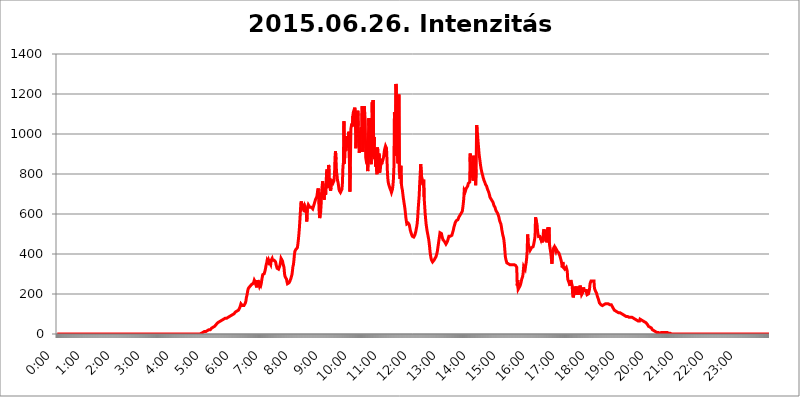
| Category | 2015.06.26. Intenzitás [W/m^2] |
|---|---|
| 0.0 | 0 |
| 0.0006944444444444445 | 0 |
| 0.001388888888888889 | 0 |
| 0.0020833333333333333 | 0 |
| 0.002777777777777778 | 0 |
| 0.003472222222222222 | 0 |
| 0.004166666666666667 | 0 |
| 0.004861111111111111 | 0 |
| 0.005555555555555556 | 0 |
| 0.0062499999999999995 | 0 |
| 0.006944444444444444 | 0 |
| 0.007638888888888889 | 0 |
| 0.008333333333333333 | 0 |
| 0.009027777777777779 | 0 |
| 0.009722222222222222 | 0 |
| 0.010416666666666666 | 0 |
| 0.011111111111111112 | 0 |
| 0.011805555555555555 | 0 |
| 0.012499999999999999 | 0 |
| 0.013194444444444444 | 0 |
| 0.013888888888888888 | 0 |
| 0.014583333333333332 | 0 |
| 0.015277777777777777 | 0 |
| 0.015972222222222224 | 0 |
| 0.016666666666666666 | 0 |
| 0.017361111111111112 | 0 |
| 0.018055555555555557 | 0 |
| 0.01875 | 0 |
| 0.019444444444444445 | 0 |
| 0.02013888888888889 | 0 |
| 0.020833333333333332 | 0 |
| 0.02152777777777778 | 0 |
| 0.022222222222222223 | 0 |
| 0.02291666666666667 | 0 |
| 0.02361111111111111 | 0 |
| 0.024305555555555556 | 0 |
| 0.024999999999999998 | 0 |
| 0.025694444444444447 | 0 |
| 0.02638888888888889 | 0 |
| 0.027083333333333334 | 0 |
| 0.027777777777777776 | 0 |
| 0.02847222222222222 | 0 |
| 0.029166666666666664 | 0 |
| 0.029861111111111113 | 0 |
| 0.030555555555555555 | 0 |
| 0.03125 | 0 |
| 0.03194444444444445 | 0 |
| 0.03263888888888889 | 0 |
| 0.03333333333333333 | 0 |
| 0.034027777777777775 | 0 |
| 0.034722222222222224 | 0 |
| 0.035416666666666666 | 0 |
| 0.036111111111111115 | 0 |
| 0.03680555555555556 | 0 |
| 0.0375 | 0 |
| 0.03819444444444444 | 0 |
| 0.03888888888888889 | 0 |
| 0.03958333333333333 | 0 |
| 0.04027777777777778 | 0 |
| 0.04097222222222222 | 0 |
| 0.041666666666666664 | 0 |
| 0.042361111111111106 | 0 |
| 0.04305555555555556 | 0 |
| 0.043750000000000004 | 0 |
| 0.044444444444444446 | 0 |
| 0.04513888888888889 | 0 |
| 0.04583333333333334 | 0 |
| 0.04652777777777778 | 0 |
| 0.04722222222222222 | 0 |
| 0.04791666666666666 | 0 |
| 0.04861111111111111 | 0 |
| 0.049305555555555554 | 0 |
| 0.049999999999999996 | 0 |
| 0.05069444444444445 | 0 |
| 0.051388888888888894 | 0 |
| 0.052083333333333336 | 0 |
| 0.05277777777777778 | 0 |
| 0.05347222222222222 | 0 |
| 0.05416666666666667 | 0 |
| 0.05486111111111111 | 0 |
| 0.05555555555555555 | 0 |
| 0.05625 | 0 |
| 0.05694444444444444 | 0 |
| 0.057638888888888885 | 0 |
| 0.05833333333333333 | 0 |
| 0.05902777777777778 | 0 |
| 0.059722222222222225 | 0 |
| 0.06041666666666667 | 0 |
| 0.061111111111111116 | 0 |
| 0.06180555555555556 | 0 |
| 0.0625 | 0 |
| 0.06319444444444444 | 0 |
| 0.06388888888888888 | 0 |
| 0.06458333333333334 | 0 |
| 0.06527777777777778 | 0 |
| 0.06597222222222222 | 0 |
| 0.06666666666666667 | 0 |
| 0.06736111111111111 | 0 |
| 0.06805555555555555 | 0 |
| 0.06874999999999999 | 0 |
| 0.06944444444444443 | 0 |
| 0.07013888888888889 | 0 |
| 0.07083333333333333 | 0 |
| 0.07152777777777779 | 0 |
| 0.07222222222222223 | 0 |
| 0.07291666666666667 | 0 |
| 0.07361111111111111 | 0 |
| 0.07430555555555556 | 0 |
| 0.075 | 0 |
| 0.07569444444444444 | 0 |
| 0.0763888888888889 | 0 |
| 0.07708333333333334 | 0 |
| 0.07777777777777778 | 0 |
| 0.07847222222222222 | 0 |
| 0.07916666666666666 | 0 |
| 0.0798611111111111 | 0 |
| 0.08055555555555556 | 0 |
| 0.08125 | 0 |
| 0.08194444444444444 | 0 |
| 0.08263888888888889 | 0 |
| 0.08333333333333333 | 0 |
| 0.08402777777777777 | 0 |
| 0.08472222222222221 | 0 |
| 0.08541666666666665 | 0 |
| 0.08611111111111112 | 0 |
| 0.08680555555555557 | 0 |
| 0.08750000000000001 | 0 |
| 0.08819444444444445 | 0 |
| 0.08888888888888889 | 0 |
| 0.08958333333333333 | 0 |
| 0.09027777777777778 | 0 |
| 0.09097222222222222 | 0 |
| 0.09166666666666667 | 0 |
| 0.09236111111111112 | 0 |
| 0.09305555555555556 | 0 |
| 0.09375 | 0 |
| 0.09444444444444444 | 0 |
| 0.09513888888888888 | 0 |
| 0.09583333333333333 | 0 |
| 0.09652777777777777 | 0 |
| 0.09722222222222222 | 0 |
| 0.09791666666666667 | 0 |
| 0.09861111111111111 | 0 |
| 0.09930555555555555 | 0 |
| 0.09999999999999999 | 0 |
| 0.10069444444444443 | 0 |
| 0.1013888888888889 | 0 |
| 0.10208333333333335 | 0 |
| 0.10277777777777779 | 0 |
| 0.10347222222222223 | 0 |
| 0.10416666666666667 | 0 |
| 0.10486111111111111 | 0 |
| 0.10555555555555556 | 0 |
| 0.10625 | 0 |
| 0.10694444444444444 | 0 |
| 0.1076388888888889 | 0 |
| 0.10833333333333334 | 0 |
| 0.10902777777777778 | 0 |
| 0.10972222222222222 | 0 |
| 0.1111111111111111 | 0 |
| 0.11180555555555556 | 0 |
| 0.11180555555555556 | 0 |
| 0.1125 | 0 |
| 0.11319444444444444 | 0 |
| 0.11388888888888889 | 0 |
| 0.11458333333333333 | 0 |
| 0.11527777777777777 | 0 |
| 0.11597222222222221 | 0 |
| 0.11666666666666665 | 0 |
| 0.1173611111111111 | 0 |
| 0.11805555555555557 | 0 |
| 0.11944444444444445 | 0 |
| 0.12013888888888889 | 0 |
| 0.12083333333333333 | 0 |
| 0.12152777777777778 | 0 |
| 0.12222222222222223 | 0 |
| 0.12291666666666667 | 0 |
| 0.12291666666666667 | 0 |
| 0.12361111111111112 | 0 |
| 0.12430555555555556 | 0 |
| 0.125 | 0 |
| 0.12569444444444444 | 0 |
| 0.12638888888888888 | 0 |
| 0.12708333333333333 | 0 |
| 0.16875 | 0 |
| 0.12847222222222224 | 0 |
| 0.12916666666666668 | 0 |
| 0.12986111111111112 | 0 |
| 0.13055555555555556 | 0 |
| 0.13125 | 0 |
| 0.13194444444444445 | 0 |
| 0.1326388888888889 | 0 |
| 0.13333333333333333 | 0 |
| 0.13402777777777777 | 0 |
| 0.13402777777777777 | 0 |
| 0.13472222222222222 | 0 |
| 0.13541666666666666 | 0 |
| 0.1361111111111111 | 0 |
| 0.13749999999999998 | 0 |
| 0.13819444444444443 | 0 |
| 0.1388888888888889 | 0 |
| 0.13958333333333334 | 0 |
| 0.14027777777777778 | 0 |
| 0.14097222222222222 | 0 |
| 0.14166666666666666 | 0 |
| 0.1423611111111111 | 0 |
| 0.14305555555555557 | 0 |
| 0.14375000000000002 | 0 |
| 0.14444444444444446 | 0 |
| 0.1451388888888889 | 0 |
| 0.1451388888888889 | 0 |
| 0.14652777777777778 | 0 |
| 0.14722222222222223 | 0 |
| 0.14791666666666667 | 0 |
| 0.1486111111111111 | 0 |
| 0.14930555555555555 | 0 |
| 0.15 | 0 |
| 0.15069444444444444 | 0 |
| 0.15138888888888888 | 0 |
| 0.15208333333333332 | 0 |
| 0.15277777777777776 | 0 |
| 0.15347222222222223 | 0 |
| 0.15416666666666667 | 0 |
| 0.15486111111111112 | 0 |
| 0.15555555555555556 | 0 |
| 0.15625 | 0 |
| 0.15694444444444444 | 0 |
| 0.15763888888888888 | 0 |
| 0.15833333333333333 | 0 |
| 0.15902777777777777 | 0 |
| 0.15972222222222224 | 0 |
| 0.16041666666666668 | 0 |
| 0.16111111111111112 | 0 |
| 0.16180555555555556 | 0 |
| 0.1625 | 0 |
| 0.16319444444444445 | 0 |
| 0.1638888888888889 | 0 |
| 0.16458333333333333 | 0 |
| 0.16527777777777777 | 0 |
| 0.16597222222222222 | 0 |
| 0.16666666666666666 | 0 |
| 0.1673611111111111 | 0 |
| 0.16805555555555554 | 0 |
| 0.16874999999999998 | 0 |
| 0.16944444444444443 | 0 |
| 0.17013888888888887 | 0 |
| 0.1708333333333333 | 0 |
| 0.17152777777777775 | 0 |
| 0.17222222222222225 | 0 |
| 0.1729166666666667 | 0 |
| 0.17361111111111113 | 0 |
| 0.17430555555555557 | 0 |
| 0.17500000000000002 | 0 |
| 0.17569444444444446 | 0 |
| 0.1763888888888889 | 0 |
| 0.17708333333333334 | 0 |
| 0.17777777777777778 | 0 |
| 0.17847222222222223 | 0 |
| 0.17916666666666667 | 0 |
| 0.1798611111111111 | 0 |
| 0.18055555555555555 | 0 |
| 0.18125 | 0 |
| 0.18194444444444444 | 0 |
| 0.1826388888888889 | 0 |
| 0.18333333333333335 | 0 |
| 0.1840277777777778 | 0 |
| 0.18472222222222223 | 0 |
| 0.18541666666666667 | 0 |
| 0.18611111111111112 | 0 |
| 0.18680555555555556 | 0 |
| 0.1875 | 0 |
| 0.18819444444444444 | 0 |
| 0.18888888888888888 | 0 |
| 0.18958333333333333 | 0 |
| 0.19027777777777777 | 0 |
| 0.1909722222222222 | 0 |
| 0.19166666666666665 | 0 |
| 0.19236111111111112 | 0 |
| 0.19305555555555554 | 0 |
| 0.19375 | 0 |
| 0.19444444444444445 | 0 |
| 0.1951388888888889 | 0 |
| 0.19583333333333333 | 0 |
| 0.19652777777777777 | 0 |
| 0.19722222222222222 | 0 |
| 0.19791666666666666 | 0 |
| 0.1986111111111111 | 0 |
| 0.19930555555555554 | 0 |
| 0.19999999999999998 | 0 |
| 0.20069444444444443 | 3.525 |
| 0.20138888888888887 | 3.525 |
| 0.2020833333333333 | 3.525 |
| 0.2027777777777778 | 3.525 |
| 0.2034722222222222 | 3.525 |
| 0.2041666666666667 | 7.887 |
| 0.20486111111111113 | 7.887 |
| 0.20555555555555557 | 7.887 |
| 0.20625000000000002 | 12.257 |
| 0.20694444444444446 | 12.257 |
| 0.2076388888888889 | 12.257 |
| 0.20833333333333334 | 12.257 |
| 0.20902777777777778 | 12.257 |
| 0.20972222222222223 | 16.636 |
| 0.21041666666666667 | 16.636 |
| 0.2111111111111111 | 16.636 |
| 0.21180555555555555 | 16.636 |
| 0.2125 | 21.024 |
| 0.21319444444444444 | 21.024 |
| 0.2138888888888889 | 21.024 |
| 0.21458333333333335 | 21.024 |
| 0.2152777777777778 | 25.419 |
| 0.21597222222222223 | 25.419 |
| 0.21666666666666667 | 29.823 |
| 0.21736111111111112 | 29.823 |
| 0.21805555555555556 | 29.823 |
| 0.21875 | 34.234 |
| 0.21944444444444444 | 34.234 |
| 0.22013888888888888 | 38.653 |
| 0.22083333333333333 | 38.653 |
| 0.22152777777777777 | 43.079 |
| 0.2222222222222222 | 43.079 |
| 0.22291666666666665 | 47.511 |
| 0.2236111111111111 | 47.511 |
| 0.22430555555555556 | 51.951 |
| 0.225 | 56.398 |
| 0.22569444444444445 | 56.398 |
| 0.2263888888888889 | 60.85 |
| 0.22708333333333333 | 60.85 |
| 0.22777777777777777 | 65.31 |
| 0.22847222222222222 | 65.31 |
| 0.22916666666666666 | 65.31 |
| 0.2298611111111111 | 69.775 |
| 0.23055555555555554 | 69.775 |
| 0.23124999999999998 | 69.775 |
| 0.23194444444444443 | 74.246 |
| 0.23263888888888887 | 74.246 |
| 0.2333333333333333 | 74.246 |
| 0.2340277777777778 | 74.246 |
| 0.2347222222222222 | 74.246 |
| 0.2354166666666667 | 78.722 |
| 0.23611111111111113 | 78.722 |
| 0.23680555555555557 | 78.722 |
| 0.23750000000000002 | 78.722 |
| 0.23819444444444446 | 78.722 |
| 0.2388888888888889 | 83.205 |
| 0.23958333333333334 | 83.205 |
| 0.24027777777777778 | 83.205 |
| 0.24097222222222223 | 87.692 |
| 0.24166666666666667 | 87.692 |
| 0.2423611111111111 | 87.692 |
| 0.24305555555555555 | 92.184 |
| 0.24375 | 92.184 |
| 0.24444444444444446 | 92.184 |
| 0.24513888888888888 | 92.184 |
| 0.24583333333333335 | 96.682 |
| 0.2465277777777778 | 96.682 |
| 0.24722222222222223 | 101.184 |
| 0.24791666666666667 | 101.184 |
| 0.24861111111111112 | 105.69 |
| 0.24930555555555556 | 105.69 |
| 0.25 | 110.201 |
| 0.25069444444444444 | 114.716 |
| 0.2513888888888889 | 114.716 |
| 0.2520833333333333 | 114.716 |
| 0.25277777777777777 | 114.716 |
| 0.2534722222222222 | 119.235 |
| 0.25416666666666665 | 119.235 |
| 0.2548611111111111 | 123.758 |
| 0.2555555555555556 | 128.284 |
| 0.25625000000000003 | 132.814 |
| 0.2569444444444445 | 141.884 |
| 0.2576388888888889 | 150.964 |
| 0.25833333333333336 | 146.423 |
| 0.2590277777777778 | 146.423 |
| 0.25972222222222224 | 141.884 |
| 0.2604166666666667 | 141.884 |
| 0.2611111111111111 | 141.884 |
| 0.26180555555555557 | 141.884 |
| 0.2625 | 146.423 |
| 0.26319444444444445 | 146.423 |
| 0.2638888888888889 | 155.509 |
| 0.26458333333333334 | 164.605 |
| 0.2652777777777778 | 182.82 |
| 0.2659722222222222 | 191.937 |
| 0.26666666666666666 | 196.497 |
| 0.2673611111111111 | 219.309 |
| 0.26805555555555555 | 228.436 |
| 0.26875 | 233 |
| 0.26944444444444443 | 233 |
| 0.2701388888888889 | 237.564 |
| 0.2708333333333333 | 242.127 |
| 0.27152777777777776 | 242.127 |
| 0.2722222222222222 | 246.689 |
| 0.27291666666666664 | 242.127 |
| 0.2736111111111111 | 246.689 |
| 0.2743055555555555 | 251.251 |
| 0.27499999999999997 | 255.813 |
| 0.27569444444444446 | 260.373 |
| 0.27638888888888885 | 269.49 |
| 0.27708333333333335 | 269.49 |
| 0.2777777777777778 | 260.373 |
| 0.27847222222222223 | 246.689 |
| 0.2791666666666667 | 242.127 |
| 0.2798611111111111 | 233 |
| 0.28055555555555556 | 237.564 |
| 0.28125 | 269.49 |
| 0.28194444444444444 | 269.49 |
| 0.2826388888888889 | 251.251 |
| 0.2833333333333333 | 242.127 |
| 0.28402777777777777 | 251.251 |
| 0.2847222222222222 | 246.689 |
| 0.28541666666666665 | 242.127 |
| 0.28611111111111115 | 251.251 |
| 0.28680555555555554 | 269.49 |
| 0.28750000000000003 | 283.156 |
| 0.2881944444444445 | 296.808 |
| 0.2888888888888889 | 301.354 |
| 0.28958333333333336 | 301.354 |
| 0.2902777777777778 | 301.354 |
| 0.29097222222222224 | 305.898 |
| 0.2916666666666667 | 319.517 |
| 0.2923611111111111 | 333.113 |
| 0.29305555555555557 | 346.682 |
| 0.29375 | 355.712 |
| 0.29444444444444445 | 369.23 |
| 0.2951388888888889 | 369.23 |
| 0.29583333333333334 | 360.221 |
| 0.2965277777777778 | 369.23 |
| 0.2972222222222222 | 364.728 |
| 0.29791666666666666 | 355.712 |
| 0.2986111111111111 | 355.712 |
| 0.29930555555555555 | 346.682 |
| 0.3 | 369.23 |
| 0.30069444444444443 | 373.729 |
| 0.3013888888888889 | 378.224 |
| 0.3020833333333333 | 369.23 |
| 0.30277777777777776 | 369.23 |
| 0.3034722222222222 | 369.23 |
| 0.30416666666666664 | 369.23 |
| 0.3048611111111111 | 364.728 |
| 0.3055555555555555 | 364.728 |
| 0.30624999999999997 | 360.221 |
| 0.3069444444444444 | 346.682 |
| 0.3076388888888889 | 342.162 |
| 0.30833333333333335 | 328.584 |
| 0.3090277777777778 | 328.584 |
| 0.30972222222222223 | 324.052 |
| 0.3104166666666667 | 324.052 |
| 0.3111111111111111 | 328.584 |
| 0.31180555555555556 | 337.639 |
| 0.3125 | 346.682 |
| 0.31319444444444444 | 360.221 |
| 0.3138888888888889 | 378.224 |
| 0.3145833333333333 | 378.224 |
| 0.31527777777777777 | 373.729 |
| 0.3159722222222222 | 364.728 |
| 0.31666666666666665 | 351.198 |
| 0.31736111111111115 | 342.162 |
| 0.31805555555555554 | 333.113 |
| 0.31875000000000003 | 301.354 |
| 0.3194444444444445 | 287.709 |
| 0.3201388888888889 | 292.259 |
| 0.32083333333333336 | 287.709 |
| 0.3215277777777778 | 274.047 |
| 0.32222222222222224 | 260.373 |
| 0.3229166666666667 | 251.251 |
| 0.3236111111111111 | 251.251 |
| 0.32430555555555557 | 255.813 |
| 0.325 | 255.813 |
| 0.32569444444444445 | 260.373 |
| 0.3263888888888889 | 264.932 |
| 0.32708333333333334 | 269.49 |
| 0.3277777777777778 | 278.603 |
| 0.3284722222222222 | 287.709 |
| 0.32916666666666666 | 296.808 |
| 0.3298611111111111 | 314.98 |
| 0.33055555555555555 | 337.639 |
| 0.33125 | 346.682 |
| 0.33194444444444443 | 369.23 |
| 0.3326388888888889 | 396.164 |
| 0.3333333333333333 | 414.035 |
| 0.3340277777777778 | 409.574 |
| 0.3347222222222222 | 422.943 |
| 0.3354166666666667 | 418.492 |
| 0.3361111111111111 | 418.492 |
| 0.3368055555555556 | 431.833 |
| 0.33749999999999997 | 449.551 |
| 0.33819444444444446 | 471.582 |
| 0.33888888888888885 | 497.836 |
| 0.33958333333333335 | 528.2 |
| 0.34027777777777773 | 566.793 |
| 0.34097222222222223 | 609.062 |
| 0.3416666666666666 | 654.791 |
| 0.3423611111111111 | 663.019 |
| 0.3430555555555555 | 638.256 |
| 0.34375 | 646.537 |
| 0.3444444444444445 | 634.105 |
| 0.3451388888888889 | 629.948 |
| 0.3458333333333334 | 642.4 |
| 0.34652777777777777 | 609.062 |
| 0.34722222222222227 | 621.613 |
| 0.34791666666666665 | 629.948 |
| 0.34861111111111115 | 625.784 |
| 0.34930555555555554 | 613.252 |
| 0.35000000000000003 | 562.53 |
| 0.3506944444444444 | 629.948 |
| 0.3513888888888889 | 638.256 |
| 0.3520833333333333 | 646.537 |
| 0.3527777777777778 | 646.537 |
| 0.3534722222222222 | 642.4 |
| 0.3541666666666667 | 634.105 |
| 0.3548611111111111 | 638.256 |
| 0.35555555555555557 | 634.105 |
| 0.35625 | 634.105 |
| 0.35694444444444445 | 634.105 |
| 0.3576388888888889 | 629.948 |
| 0.35833333333333334 | 625.784 |
| 0.3590277777777778 | 634.105 |
| 0.3597222222222222 | 642.4 |
| 0.36041666666666666 | 646.537 |
| 0.3611111111111111 | 658.909 |
| 0.36180555555555555 | 667.123 |
| 0.3625 | 675.311 |
| 0.36319444444444443 | 679.395 |
| 0.3638888888888889 | 683.473 |
| 0.3645833333333333 | 683.473 |
| 0.3652777777777778 | 715.858 |
| 0.3659722222222222 | 727.896 |
| 0.3666666666666667 | 675.311 |
| 0.3673611111111111 | 609.062 |
| 0.3680555555555556 | 579.542 |
| 0.36874999999999997 | 592.233 |
| 0.36944444444444446 | 609.062 |
| 0.37013888888888885 | 650.667 |
| 0.37083333333333335 | 711.832 |
| 0.37152777777777773 | 739.877 |
| 0.37222222222222223 | 763.674 |
| 0.3729166666666666 | 735.89 |
| 0.3736111111111111 | 703.762 |
| 0.3743055555555555 | 671.22 |
| 0.375 | 711.832 |
| 0.3756944444444445 | 731.896 |
| 0.3763888888888889 | 695.666 |
| 0.3770833333333334 | 751.803 |
| 0.37777777777777777 | 810.641 |
| 0.37847222222222227 | 822.26 |
| 0.37916666666666665 | 731.896 |
| 0.37986111111111115 | 779.42 |
| 0.38055555555555554 | 845.365 |
| 0.38125000000000003 | 833.834 |
| 0.3819444444444444 | 743.859 |
| 0.3826388888888889 | 727.896 |
| 0.3833333333333333 | 715.858 |
| 0.3840277777777778 | 731.896 |
| 0.3847222222222222 | 755.766 |
| 0.3854166666666667 | 763.674 |
| 0.3861111111111111 | 759.723 |
| 0.38680555555555557 | 755.766 |
| 0.3875 | 755.766 |
| 0.38819444444444445 | 767.62 |
| 0.3888888888888889 | 798.974 |
| 0.38958333333333334 | 883.516 |
| 0.3902777777777778 | 913.766 |
| 0.3909722222222222 | 872.114 |
| 0.39166666666666666 | 810.641 |
| 0.3923611111111111 | 795.074 |
| 0.39305555555555555 | 767.62 |
| 0.39375 | 759.723 |
| 0.39444444444444443 | 743.859 |
| 0.3951388888888889 | 723.889 |
| 0.3958333333333333 | 715.858 |
| 0.3965277777777778 | 711.832 |
| 0.3972222222222222 | 707.8 |
| 0.3979166666666667 | 711.832 |
| 0.3986111111111111 | 707.8 |
| 0.3993055555555556 | 723.889 |
| 0.39999999999999997 | 755.766 |
| 0.40069444444444446 | 837.682 |
| 0.40138888888888885 | 856.855 |
| 0.40208333333333335 | 1063.51 |
| 0.40277777777777773 | 853.029 |
| 0.40347222222222223 | 917.534 |
| 0.4041666666666666 | 958.814 |
| 0.4048611111111111 | 917.534 |
| 0.4055555555555555 | 988.714 |
| 0.40625 | 977.508 |
| 0.4069444444444445 | 955.071 |
| 0.4076388888888889 | 943.832 |
| 0.4083333333333334 | 932.576 |
| 0.40902777777777777 | 1011.118 |
| 0.40972222222222227 | 879.719 |
| 0.41041666666666665 | 711.832 |
| 0.41111111111111115 | 837.682 |
| 0.41180555555555554 | 1026.06 |
| 0.41250000000000003 | 1026.06 |
| 0.4131944444444444 | 1052.255 |
| 0.4138888888888889 | 1037.277 |
| 0.4145833333333333 | 1089.873 |
| 0.4152777777777778 | 1108.816 |
| 0.4159722222222222 | 1116.426 |
| 0.4166666666666667 | 1124.056 |
| 0.4173611111111111 | 1131.708 |
| 0.41805555555555557 | 1093.653 |
| 0.41875 | 928.819 |
| 0.41944444444444445 | 973.772 |
| 0.4201388888888889 | 1056.004 |
| 0.42083333333333334 | 1044.762 |
| 0.4215277777777778 | 1116.426 |
| 0.4222222222222222 | 1041.019 |
| 0.42291666666666666 | 947.58 |
| 0.4236111111111111 | 906.223 |
| 0.42430555555555555 | 936.33 |
| 0.425 | 988.714 |
| 0.42569444444444443 | 1022.323 |
| 0.4263888888888889 | 1033.537 |
| 0.4270833333333333 | 996.182 |
| 0.4277777777777778 | 1139.384 |
| 0.4284722222222222 | 909.996 |
| 0.4291666666666667 | 988.714 |
| 0.4298611111111111 | 1052.255 |
| 0.4305555555555556 | 1139.384 |
| 0.43124999999999997 | 1101.226 |
| 0.43194444444444446 | 1067.267 |
| 0.43263888888888885 | 883.516 |
| 0.43333333333333335 | 879.719 |
| 0.43402777777777773 | 853.029 |
| 0.43472222222222223 | 864.493 |
| 0.4354166666666666 | 814.519 |
| 0.4361111111111111 | 868.305 |
| 0.4368055555555555 | 1078.555 |
| 0.4375 | 1041.019 |
| 0.4381944444444445 | 1078.555 |
| 0.4388888888888889 | 932.576 |
| 0.4395833333333334 | 864.493 |
| 0.44027777777777777 | 849.199 |
| 0.44097222222222227 | 932.576 |
| 0.44166666666666665 | 1158.689 |
| 0.44236111111111115 | 1044.762 |
| 0.44305555555555554 | 1170.358 |
| 0.44375000000000003 | 947.58 |
| 0.4444444444444444 | 984.98 |
| 0.4451388888888889 | 875.918 |
| 0.4458333333333333 | 902.447 |
| 0.4465277777777778 | 837.682 |
| 0.4472222222222222 | 864.493 |
| 0.4479166666666667 | 814.519 |
| 0.4486111111111111 | 798.974 |
| 0.44930555555555557 | 932.576 |
| 0.45 | 818.392 |
| 0.45069444444444445 | 864.493 |
| 0.4513888888888889 | 902.447 |
| 0.45208333333333334 | 806.757 |
| 0.4527777777777778 | 814.519 |
| 0.4534722222222222 | 833.834 |
| 0.45416666666666666 | 875.918 |
| 0.4548611111111111 | 849.199 |
| 0.45555555555555555 | 856.855 |
| 0.45625 | 853.029 |
| 0.45694444444444443 | 872.114 |
| 0.4576388888888889 | 883.516 |
| 0.4583333333333333 | 887.309 |
| 0.4590277777777778 | 921.298 |
| 0.4597222222222222 | 917.534 |
| 0.4604166666666667 | 940.082 |
| 0.4611111111111111 | 943.832 |
| 0.4618055555555556 | 928.819 |
| 0.46249999999999997 | 868.305 |
| 0.46319444444444446 | 798.974 |
| 0.46388888888888885 | 767.62 |
| 0.46458333333333335 | 751.803 |
| 0.46527777777777773 | 743.859 |
| 0.46597222222222223 | 735.89 |
| 0.4666666666666666 | 727.896 |
| 0.4673611111111111 | 723.889 |
| 0.4680555555555555 | 715.858 |
| 0.46875 | 707.8 |
| 0.4694444444444445 | 711.832 |
| 0.4701388888888889 | 723.889 |
| 0.4708333333333334 | 743.859 |
| 0.47152777777777777 | 775.492 |
| 0.47222222222222227 | 837.682 |
| 0.47291666666666665 | 1108.816 |
| 0.47361111111111115 | 936.33 |
| 0.47430555555555554 | 891.099 |
| 0.47500000000000003 | 1250.275 |
| 0.4756944444444444 | 1221.83 |
| 0.4763888888888889 | 1026.06 |
| 0.4770833333333333 | 894.885 |
| 0.4777777777777778 | 853.029 |
| 0.4784722222222222 | 977.508 |
| 0.4791666666666667 | 1197.876 |
| 0.4798611111111111 | 810.641 |
| 0.48055555555555557 | 775.492 |
| 0.48125 | 783.342 |
| 0.48194444444444445 | 841.526 |
| 0.4826388888888889 | 751.803 |
| 0.48333333333333334 | 731.896 |
| 0.4840277777777778 | 719.877 |
| 0.4847222222222222 | 699.717 |
| 0.48541666666666666 | 679.395 |
| 0.4861111111111111 | 663.019 |
| 0.48680555555555555 | 646.537 |
| 0.4875 | 629.948 |
| 0.48819444444444443 | 609.062 |
| 0.4888888888888889 | 583.779 |
| 0.4895833333333333 | 566.793 |
| 0.4902777777777778 | 549.704 |
| 0.4909722222222222 | 549.704 |
| 0.4916666666666667 | 549.704 |
| 0.4923611111111111 | 553.986 |
| 0.4930555555555556 | 553.986 |
| 0.49374999999999997 | 545.416 |
| 0.49444444444444446 | 532.513 |
| 0.49513888888888885 | 519.555 |
| 0.49583333333333335 | 510.885 |
| 0.49652777777777773 | 502.192 |
| 0.49722222222222223 | 497.836 |
| 0.4979166666666666 | 489.108 |
| 0.4986111111111111 | 484.735 |
| 0.4993055555555555 | 484.735 |
| 0.5 | 484.735 |
| 0.5006944444444444 | 484.735 |
| 0.5013888888888889 | 493.475 |
| 0.5020833333333333 | 502.192 |
| 0.5027777777777778 | 510.885 |
| 0.5034722222222222 | 523.88 |
| 0.5041666666666667 | 536.82 |
| 0.5048611111111111 | 553.986 |
| 0.5055555555555555 | 583.779 |
| 0.50625 | 625.784 |
| 0.5069444444444444 | 658.909 |
| 0.5076388888888889 | 691.608 |
| 0.5083333333333333 | 751.803 |
| 0.5090277777777777 | 795.074 |
| 0.5097222222222222 | 849.199 |
| 0.5104166666666666 | 845.365 |
| 0.5111111111111112 | 783.342 |
| 0.5118055555555555 | 775.492 |
| 0.5125000000000001 | 751.803 |
| 0.5131944444444444 | 743.859 |
| 0.513888888888889 | 771.559 |
| 0.5145833333333333 | 683.473 |
| 0.5152777777777778 | 642.4 |
| 0.5159722222222222 | 604.864 |
| 0.5166666666666667 | 575.299 |
| 0.517361111111111 | 549.704 |
| 0.5180555555555556 | 532.513 |
| 0.5187499999999999 | 515.223 |
| 0.5194444444444445 | 502.192 |
| 0.5201388888888888 | 489.108 |
| 0.5208333333333334 | 475.972 |
| 0.5215277777777778 | 458.38 |
| 0.5222222222222223 | 436.27 |
| 0.5229166666666667 | 409.574 |
| 0.5236111111111111 | 391.685 |
| 0.5243055555555556 | 378.224 |
| 0.525 | 369.23 |
| 0.5256944444444445 | 364.728 |
| 0.5263888888888889 | 360.221 |
| 0.5270833333333333 | 360.221 |
| 0.5277777777777778 | 364.728 |
| 0.5284722222222222 | 369.23 |
| 0.5291666666666667 | 373.729 |
| 0.5298611111111111 | 378.224 |
| 0.5305555555555556 | 382.715 |
| 0.53125 | 387.202 |
| 0.5319444444444444 | 396.164 |
| 0.5326388888888889 | 405.108 |
| 0.5333333333333333 | 418.492 |
| 0.5340277777777778 | 436.27 |
| 0.5347222222222222 | 453.968 |
| 0.5354166666666667 | 471.582 |
| 0.5361111111111111 | 489.108 |
| 0.5368055555555555 | 506.542 |
| 0.5375 | 510.885 |
| 0.5381944444444444 | 510.885 |
| 0.5388888888888889 | 502.192 |
| 0.5395833333333333 | 489.108 |
| 0.5402777777777777 | 480.356 |
| 0.5409722222222222 | 471.582 |
| 0.5416666666666666 | 471.582 |
| 0.5423611111111112 | 467.187 |
| 0.5430555555555555 | 462.786 |
| 0.5437500000000001 | 462.786 |
| 0.5444444444444444 | 458.38 |
| 0.545138888888889 | 449.551 |
| 0.5458333333333333 | 449.551 |
| 0.5465277777777778 | 453.968 |
| 0.5472222222222222 | 462.786 |
| 0.5479166666666667 | 471.582 |
| 0.548611111111111 | 480.356 |
| 0.5493055555555556 | 489.108 |
| 0.5499999999999999 | 493.475 |
| 0.5506944444444445 | 493.475 |
| 0.5513888888888888 | 489.108 |
| 0.5520833333333334 | 489.108 |
| 0.5527777777777778 | 489.108 |
| 0.5534722222222223 | 493.475 |
| 0.5541666666666667 | 502.192 |
| 0.5548611111111111 | 510.885 |
| 0.5555555555555556 | 519.555 |
| 0.55625 | 532.513 |
| 0.5569444444444445 | 541.121 |
| 0.5576388888888889 | 549.704 |
| 0.5583333333333333 | 558.261 |
| 0.5590277777777778 | 562.53 |
| 0.5597222222222222 | 566.793 |
| 0.5604166666666667 | 562.53 |
| 0.5611111111111111 | 566.793 |
| 0.5618055555555556 | 571.049 |
| 0.5625 | 575.299 |
| 0.5631944444444444 | 583.779 |
| 0.5638888888888889 | 588.009 |
| 0.5645833333333333 | 592.233 |
| 0.5652777777777778 | 596.45 |
| 0.5659722222222222 | 600.661 |
| 0.5666666666666667 | 600.661 |
| 0.5673611111111111 | 604.864 |
| 0.5680555555555555 | 613.252 |
| 0.56875 | 629.948 |
| 0.5694444444444444 | 650.667 |
| 0.5701388888888889 | 675.311 |
| 0.5708333333333333 | 719.877 |
| 0.5715277777777777 | 719.877 |
| 0.5722222222222222 | 711.832 |
| 0.5729166666666666 | 715.858 |
| 0.5736111111111112 | 727.896 |
| 0.5743055555555555 | 731.896 |
| 0.5750000000000001 | 727.896 |
| 0.5756944444444444 | 739.877 |
| 0.576388888888889 | 751.803 |
| 0.5770833333333333 | 755.766 |
| 0.5777777777777778 | 747.834 |
| 0.5784722222222222 | 759.723 |
| 0.5791666666666667 | 902.447 |
| 0.579861111111111 | 791.169 |
| 0.5805555555555556 | 795.074 |
| 0.5812499999999999 | 853.029 |
| 0.5819444444444445 | 783.342 |
| 0.5826388888888888 | 791.169 |
| 0.5833333333333334 | 767.62 |
| 0.5840277777777778 | 891.099 |
| 0.5847222222222223 | 798.974 |
| 0.5854166666666667 | 860.676 |
| 0.5861111111111111 | 810.641 |
| 0.5868055555555556 | 743.859 |
| 0.5875 | 822.26 |
| 0.5881944444444445 | 1044.762 |
| 0.5888888888888889 | 1022.323 |
| 0.5895833333333333 | 992.448 |
| 0.5902777777777778 | 958.814 |
| 0.5909722222222222 | 928.819 |
| 0.5916666666666667 | 898.668 |
| 0.5923611111111111 | 879.719 |
| 0.5930555555555556 | 860.676 |
| 0.59375 | 841.526 |
| 0.5944444444444444 | 826.123 |
| 0.5951388888888889 | 814.519 |
| 0.5958333333333333 | 802.868 |
| 0.5965277777777778 | 795.074 |
| 0.5972222222222222 | 783.342 |
| 0.5979166666666667 | 775.492 |
| 0.5986111111111111 | 767.62 |
| 0.5993055555555555 | 763.674 |
| 0.6 | 755.766 |
| 0.6006944444444444 | 747.834 |
| 0.6013888888888889 | 743.859 |
| 0.6020833333333333 | 739.877 |
| 0.6027777777777777 | 731.896 |
| 0.6034722222222222 | 723.889 |
| 0.6041666666666666 | 719.877 |
| 0.6048611111111112 | 711.832 |
| 0.6055555555555555 | 703.762 |
| 0.6062500000000001 | 695.666 |
| 0.6069444444444444 | 683.473 |
| 0.607638888888889 | 683.473 |
| 0.6083333333333333 | 675.311 |
| 0.6090277777777778 | 671.22 |
| 0.6097222222222222 | 667.123 |
| 0.6104166666666667 | 663.019 |
| 0.611111111111111 | 658.909 |
| 0.6118055555555556 | 650.667 |
| 0.6124999999999999 | 642.4 |
| 0.6131944444444445 | 638.256 |
| 0.6138888888888888 | 634.105 |
| 0.6145833333333334 | 625.784 |
| 0.6152777777777778 | 617.436 |
| 0.6159722222222223 | 617.436 |
| 0.6166666666666667 | 613.252 |
| 0.6173611111111111 | 604.864 |
| 0.6180555555555556 | 600.661 |
| 0.61875 | 592.233 |
| 0.6194444444444445 | 583.779 |
| 0.6201388888888889 | 571.049 |
| 0.6208333333333333 | 562.53 |
| 0.6215277777777778 | 558.261 |
| 0.6222222222222222 | 549.704 |
| 0.6229166666666667 | 536.82 |
| 0.6236111111111111 | 519.555 |
| 0.6243055555555556 | 506.542 |
| 0.625 | 493.475 |
| 0.6256944444444444 | 484.735 |
| 0.6263888888888889 | 471.582 |
| 0.6270833333333333 | 449.551 |
| 0.6277777777777778 | 418.492 |
| 0.6284722222222222 | 387.202 |
| 0.6291666666666667 | 373.729 |
| 0.6298611111111111 | 364.728 |
| 0.6305555555555555 | 355.712 |
| 0.63125 | 355.712 |
| 0.6319444444444444 | 351.198 |
| 0.6326388888888889 | 351.198 |
| 0.6333333333333333 | 351.198 |
| 0.6340277777777777 | 351.198 |
| 0.6347222222222222 | 346.682 |
| 0.6354166666666666 | 346.682 |
| 0.6361111111111112 | 346.682 |
| 0.6368055555555555 | 346.682 |
| 0.6375000000000001 | 346.682 |
| 0.6381944444444444 | 346.682 |
| 0.638888888888889 | 346.682 |
| 0.6395833333333333 | 346.682 |
| 0.6402777777777778 | 346.682 |
| 0.6409722222222222 | 346.682 |
| 0.6416666666666667 | 342.162 |
| 0.642361111111111 | 342.162 |
| 0.6430555555555556 | 342.162 |
| 0.6437499999999999 | 346.682 |
| 0.6444444444444445 | 333.113 |
| 0.6451388888888888 | 242.127 |
| 0.6458333333333334 | 269.49 |
| 0.6465277777777778 | 223.873 |
| 0.6472222222222223 | 228.436 |
| 0.6479166666666667 | 233 |
| 0.6486111111111111 | 233 |
| 0.6493055555555556 | 242.127 |
| 0.65 | 251.251 |
| 0.6506944444444445 | 260.373 |
| 0.6513888888888889 | 274.047 |
| 0.6520833333333333 | 278.603 |
| 0.6527777777777778 | 287.709 |
| 0.6534722222222222 | 305.898 |
| 0.6541666666666667 | 337.639 |
| 0.6548611111111111 | 333.113 |
| 0.6555555555555556 | 333.113 |
| 0.65625 | 324.052 |
| 0.6569444444444444 | 342.162 |
| 0.6576388888888889 | 355.712 |
| 0.6583333333333333 | 378.224 |
| 0.6590277777777778 | 409.574 |
| 0.6597222222222222 | 497.836 |
| 0.6604166666666667 | 462.786 |
| 0.6611111111111111 | 440.702 |
| 0.6618055555555555 | 436.27 |
| 0.6625 | 427.39 |
| 0.6631944444444444 | 418.492 |
| 0.6638888888888889 | 414.035 |
| 0.6645833333333333 | 422.943 |
| 0.6652777777777777 | 431.833 |
| 0.6659722222222222 | 436.27 |
| 0.6666666666666666 | 436.27 |
| 0.6673611111111111 | 436.27 |
| 0.6680555555555556 | 445.129 |
| 0.6687500000000001 | 458.38 |
| 0.6694444444444444 | 471.582 |
| 0.6701388888888888 | 489.108 |
| 0.6708333333333334 | 583.779 |
| 0.6715277777777778 | 588.009 |
| 0.6722222222222222 | 558.261 |
| 0.6729166666666666 | 549.704 |
| 0.6736111111111112 | 515.223 |
| 0.6743055555555556 | 497.836 |
| 0.6749999999999999 | 502.192 |
| 0.6756944444444444 | 480.356 |
| 0.6763888888888889 | 493.475 |
| 0.6770833333333334 | 497.836 |
| 0.6777777777777777 | 489.108 |
| 0.6784722222222223 | 471.582 |
| 0.6791666666666667 | 480.356 |
| 0.6798611111111111 | 458.38 |
| 0.6805555555555555 | 462.786 |
| 0.68125 | 475.972 |
| 0.6819444444444445 | 515.223 |
| 0.6826388888888889 | 523.88 |
| 0.6833333333333332 | 510.885 |
| 0.6840277777777778 | 480.356 |
| 0.6847222222222222 | 519.555 |
| 0.6854166666666667 | 462.786 |
| 0.686111111111111 | 489.108 |
| 0.6868055555555556 | 458.38 |
| 0.6875 | 515.223 |
| 0.6881944444444444 | 532.513 |
| 0.688888888888889 | 467.187 |
| 0.6895833333333333 | 532.513 |
| 0.6902777777777778 | 449.551 |
| 0.6909722222222222 | 445.129 |
| 0.6916666666666668 | 449.551 |
| 0.6923611111111111 | 400.638 |
| 0.6930555555555555 | 400.638 |
| 0.69375 | 351.198 |
| 0.6944444444444445 | 355.712 |
| 0.6951388888888889 | 418.492 |
| 0.6958333333333333 | 427.39 |
| 0.6965277777777777 | 431.833 |
| 0.6972222222222223 | 436.27 |
| 0.6979166666666666 | 440.702 |
| 0.6986111111111111 | 436.27 |
| 0.6993055555555556 | 414.035 |
| 0.7000000000000001 | 422.943 |
| 0.7006944444444444 | 418.492 |
| 0.7013888888888888 | 414.035 |
| 0.7020833333333334 | 414.035 |
| 0.7027777777777778 | 409.574 |
| 0.7034722222222222 | 405.108 |
| 0.7041666666666666 | 400.638 |
| 0.7048611111111112 | 391.685 |
| 0.7055555555555556 | 382.715 |
| 0.7062499999999999 | 373.729 |
| 0.7069444444444444 | 364.728 |
| 0.7076388888888889 | 360.221 |
| 0.7083333333333334 | 333.113 |
| 0.7090277777777777 | 360.221 |
| 0.7097222222222223 | 333.113 |
| 0.7104166666666667 | 333.113 |
| 0.7111111111111111 | 337.639 |
| 0.7118055555555555 | 324.052 |
| 0.7125 | 328.584 |
| 0.7131944444444445 | 328.584 |
| 0.7138888888888889 | 333.113 |
| 0.7145833333333332 | 324.052 |
| 0.7152777777777778 | 314.98 |
| 0.7159722222222222 | 274.047 |
| 0.7166666666666667 | 274.047 |
| 0.717361111111111 | 260.373 |
| 0.7180555555555556 | 269.49 |
| 0.71875 | 274.047 |
| 0.7194444444444444 | 242.127 |
| 0.720138888888889 | 269.49 |
| 0.7208333333333333 | 264.932 |
| 0.7215277777777778 | 251.251 |
| 0.7222222222222222 | 242.127 |
| 0.7229166666666668 | 196.497 |
| 0.7236111111111111 | 182.82 |
| 0.7243055555555555 | 191.937 |
| 0.725 | 219.309 |
| 0.7256944444444445 | 237.564 |
| 0.7263888888888889 | 237.564 |
| 0.7270833333333333 | 219.309 |
| 0.7277777777777777 | 196.497 |
| 0.7284722222222223 | 196.497 |
| 0.7291666666666666 | 228.436 |
| 0.7298611111111111 | 237.564 |
| 0.7305555555555556 | 196.497 |
| 0.7312500000000001 | 210.182 |
| 0.7319444444444444 | 210.182 |
| 0.7326388888888888 | 210.182 |
| 0.7333333333333334 | 242.127 |
| 0.7340277777777778 | 242.127 |
| 0.7347222222222222 | 237.564 |
| 0.7354166666666666 | 196.497 |
| 0.7361111111111112 | 201.058 |
| 0.7368055555555556 | 205.62 |
| 0.7374999999999999 | 219.309 |
| 0.7381944444444444 | 233 |
| 0.7388888888888889 | 219.309 |
| 0.7395833333333334 | 223.873 |
| 0.7402777777777777 | 223.873 |
| 0.7409722222222223 | 214.746 |
| 0.7416666666666667 | 223.873 |
| 0.7423611111111111 | 205.62 |
| 0.7430555555555555 | 196.497 |
| 0.74375 | 196.497 |
| 0.7444444444444445 | 196.497 |
| 0.7451388888888889 | 201.058 |
| 0.7458333333333332 | 205.62 |
| 0.7465277777777778 | 223.873 |
| 0.7472222222222222 | 251.251 |
| 0.7479166666666667 | 251.251 |
| 0.748611111111111 | 264.932 |
| 0.7493055555555556 | 269.49 |
| 0.75 | 269.49 |
| 0.7506944444444444 | 264.932 |
| 0.751388888888889 | 269.49 |
| 0.7520833333333333 | 269.49 |
| 0.7527777777777778 | 264.932 |
| 0.7534722222222222 | 228.436 |
| 0.7541666666666668 | 228.436 |
| 0.7548611111111111 | 214.746 |
| 0.7555555555555555 | 210.182 |
| 0.75625 | 205.62 |
| 0.7569444444444445 | 196.497 |
| 0.7576388888888889 | 187.378 |
| 0.7583333333333333 | 182.82 |
| 0.7590277777777777 | 173.709 |
| 0.7597222222222223 | 164.605 |
| 0.7604166666666666 | 155.509 |
| 0.7611111111111111 | 150.964 |
| 0.7618055555555556 | 150.964 |
| 0.7625000000000001 | 146.423 |
| 0.7631944444444444 | 146.423 |
| 0.7638888888888888 | 146.423 |
| 0.7645833333333334 | 141.884 |
| 0.7652777777777778 | 141.884 |
| 0.7659722222222222 | 141.884 |
| 0.7666666666666666 | 146.423 |
| 0.7673611111111112 | 146.423 |
| 0.7680555555555556 | 146.423 |
| 0.7687499999999999 | 150.964 |
| 0.7694444444444444 | 150.964 |
| 0.7701388888888889 | 150.964 |
| 0.7708333333333334 | 150.964 |
| 0.7715277777777777 | 150.964 |
| 0.7722222222222223 | 150.964 |
| 0.7729166666666667 | 150.964 |
| 0.7736111111111111 | 146.423 |
| 0.7743055555555555 | 146.423 |
| 0.775 | 146.423 |
| 0.7756944444444445 | 146.423 |
| 0.7763888888888889 | 146.423 |
| 0.7770833333333332 | 146.423 |
| 0.7777777777777778 | 141.884 |
| 0.7784722222222222 | 137.347 |
| 0.7791666666666667 | 137.347 |
| 0.779861111111111 | 128.284 |
| 0.7805555555555556 | 128.284 |
| 0.78125 | 119.235 |
| 0.7819444444444444 | 119.235 |
| 0.782638888888889 | 119.235 |
| 0.7833333333333333 | 114.716 |
| 0.7840277777777778 | 114.716 |
| 0.7847222222222222 | 114.716 |
| 0.7854166666666668 | 110.201 |
| 0.7861111111111111 | 110.201 |
| 0.7868055555555555 | 105.69 |
| 0.7875 | 105.69 |
| 0.7881944444444445 | 105.69 |
| 0.7888888888888889 | 105.69 |
| 0.7895833333333333 | 105.69 |
| 0.7902777777777777 | 101.184 |
| 0.7909722222222223 | 101.184 |
| 0.7916666666666666 | 101.184 |
| 0.7923611111111111 | 96.682 |
| 0.7930555555555556 | 96.682 |
| 0.7937500000000001 | 96.682 |
| 0.7944444444444444 | 96.682 |
| 0.7951388888888888 | 96.682 |
| 0.7958333333333334 | 92.184 |
| 0.7965277777777778 | 92.184 |
| 0.7972222222222222 | 92.184 |
| 0.7979166666666666 | 87.692 |
| 0.7986111111111112 | 87.692 |
| 0.7993055555555556 | 87.692 |
| 0.7999999999999999 | 87.692 |
| 0.8006944444444444 | 87.692 |
| 0.8013888888888889 | 83.205 |
| 0.8020833333333334 | 83.205 |
| 0.8027777777777777 | 83.205 |
| 0.8034722222222223 | 83.205 |
| 0.8041666666666667 | 83.205 |
| 0.8048611111111111 | 83.205 |
| 0.8055555555555555 | 83.205 |
| 0.80625 | 83.205 |
| 0.8069444444444445 | 83.205 |
| 0.8076388888888889 | 78.722 |
| 0.8083333333333332 | 78.722 |
| 0.8090277777777778 | 78.722 |
| 0.8097222222222222 | 74.246 |
| 0.8104166666666667 | 74.246 |
| 0.811111111111111 | 74.246 |
| 0.8118055555555556 | 74.246 |
| 0.8125 | 69.775 |
| 0.8131944444444444 | 69.775 |
| 0.813888888888889 | 65.31 |
| 0.8145833333333333 | 65.31 |
| 0.8152777777777778 | 65.31 |
| 0.8159722222222222 | 65.31 |
| 0.8166666666666668 | 65.31 |
| 0.8173611111111111 | 74.246 |
| 0.8180555555555555 | 74.246 |
| 0.81875 | 74.246 |
| 0.8194444444444445 | 69.775 |
| 0.8201388888888889 | 69.775 |
| 0.8208333333333333 | 69.775 |
| 0.8215277777777777 | 65.31 |
| 0.8222222222222223 | 65.31 |
| 0.8229166666666666 | 65.31 |
| 0.8236111111111111 | 60.85 |
| 0.8243055555555556 | 56.398 |
| 0.8250000000000001 | 56.398 |
| 0.8256944444444444 | 56.398 |
| 0.8263888888888888 | 51.951 |
| 0.8270833333333334 | 51.951 |
| 0.8277777777777778 | 47.511 |
| 0.8284722222222222 | 43.079 |
| 0.8291666666666666 | 38.653 |
| 0.8298611111111112 | 38.653 |
| 0.8305555555555556 | 34.234 |
| 0.8312499999999999 | 34.234 |
| 0.8319444444444444 | 29.823 |
| 0.8326388888888889 | 29.823 |
| 0.8333333333333334 | 29.823 |
| 0.8340277777777777 | 25.419 |
| 0.8347222222222223 | 21.024 |
| 0.8354166666666667 | 21.024 |
| 0.8361111111111111 | 16.636 |
| 0.8368055555555555 | 16.636 |
| 0.8375 | 16.636 |
| 0.8381944444444445 | 12.257 |
| 0.8388888888888889 | 12.257 |
| 0.8395833333333332 | 12.257 |
| 0.8402777777777778 | 12.257 |
| 0.8409722222222222 | 7.887 |
| 0.8416666666666667 | 7.887 |
| 0.842361111111111 | 7.887 |
| 0.8430555555555556 | 7.887 |
| 0.84375 | 7.887 |
| 0.8444444444444444 | 7.887 |
| 0.845138888888889 | 3.525 |
| 0.8458333333333333 | 7.887 |
| 0.8465277777777778 | 7.887 |
| 0.8472222222222222 | 7.887 |
| 0.8479166666666668 | 7.887 |
| 0.8486111111111111 | 7.887 |
| 0.8493055555555555 | 7.887 |
| 0.85 | 7.887 |
| 0.8506944444444445 | 7.887 |
| 0.8513888888888889 | 7.887 |
| 0.8520833333333333 | 12.257 |
| 0.8527777777777777 | 12.257 |
| 0.8534722222222223 | 7.887 |
| 0.8541666666666666 | 7.887 |
| 0.8548611111111111 | 7.887 |
| 0.8555555555555556 | 7.887 |
| 0.8562500000000001 | 7.887 |
| 0.8569444444444444 | 3.525 |
| 0.8576388888888888 | 3.525 |
| 0.8583333333333334 | 3.525 |
| 0.8590277777777778 | 3.525 |
| 0.8597222222222222 | 3.525 |
| 0.8604166666666666 | 3.525 |
| 0.8611111111111112 | 3.525 |
| 0.8618055555555556 | 0 |
| 0.8624999999999999 | 0 |
| 0.8631944444444444 | 0 |
| 0.8638888888888889 | 0 |
| 0.8645833333333334 | 0 |
| 0.8652777777777777 | 0 |
| 0.8659722222222223 | 0 |
| 0.8666666666666667 | 0 |
| 0.8673611111111111 | 0 |
| 0.8680555555555555 | 0 |
| 0.86875 | 0 |
| 0.8694444444444445 | 0 |
| 0.8701388888888889 | 0 |
| 0.8708333333333332 | 0 |
| 0.8715277777777778 | 0 |
| 0.8722222222222222 | 0 |
| 0.8729166666666667 | 0 |
| 0.873611111111111 | 0 |
| 0.8743055555555556 | 0 |
| 0.875 | 0 |
| 0.8756944444444444 | 0 |
| 0.876388888888889 | 0 |
| 0.8770833333333333 | 0 |
| 0.8777777777777778 | 0 |
| 0.8784722222222222 | 0 |
| 0.8791666666666668 | 0 |
| 0.8798611111111111 | 0 |
| 0.8805555555555555 | 0 |
| 0.88125 | 0 |
| 0.8819444444444445 | 0 |
| 0.8826388888888889 | 0 |
| 0.8833333333333333 | 0 |
| 0.8840277777777777 | 0 |
| 0.8847222222222223 | 0 |
| 0.8854166666666666 | 0 |
| 0.8861111111111111 | 0 |
| 0.8868055555555556 | 0 |
| 0.8875000000000001 | 0 |
| 0.8881944444444444 | 0 |
| 0.8888888888888888 | 0 |
| 0.8895833333333334 | 0 |
| 0.8902777777777778 | 0 |
| 0.8909722222222222 | 0 |
| 0.8916666666666666 | 0 |
| 0.8923611111111112 | 0 |
| 0.8930555555555556 | 0 |
| 0.8937499999999999 | 0 |
| 0.8944444444444444 | 0 |
| 0.8951388888888889 | 0 |
| 0.8958333333333334 | 0 |
| 0.8965277777777777 | 0 |
| 0.8972222222222223 | 0 |
| 0.8979166666666667 | 0 |
| 0.8986111111111111 | 0 |
| 0.8993055555555555 | 0 |
| 0.9 | 0 |
| 0.9006944444444445 | 0 |
| 0.9013888888888889 | 0 |
| 0.9020833333333332 | 0 |
| 0.9027777777777778 | 0 |
| 0.9034722222222222 | 0 |
| 0.9041666666666667 | 0 |
| 0.904861111111111 | 0 |
| 0.9055555555555556 | 0 |
| 0.90625 | 0 |
| 0.9069444444444444 | 0 |
| 0.907638888888889 | 0 |
| 0.9083333333333333 | 0 |
| 0.9090277777777778 | 0 |
| 0.9097222222222222 | 0 |
| 0.9104166666666668 | 0 |
| 0.9111111111111111 | 0 |
| 0.9118055555555555 | 0 |
| 0.9125 | 0 |
| 0.9131944444444445 | 0 |
| 0.9138888888888889 | 0 |
| 0.9145833333333333 | 0 |
| 0.9152777777777777 | 0 |
| 0.9159722222222223 | 0 |
| 0.9166666666666666 | 0 |
| 0.9173611111111111 | 0 |
| 0.9180555555555556 | 0 |
| 0.9187500000000001 | 0 |
| 0.9194444444444444 | 0 |
| 0.9201388888888888 | 0 |
| 0.9208333333333334 | 0 |
| 0.9215277777777778 | 0 |
| 0.9222222222222222 | 0 |
| 0.9229166666666666 | 0 |
| 0.9236111111111112 | 0 |
| 0.9243055555555556 | 0 |
| 0.9249999999999999 | 0 |
| 0.9256944444444444 | 0 |
| 0.9263888888888889 | 0 |
| 0.9270833333333334 | 0 |
| 0.9277777777777777 | 0 |
| 0.9284722222222223 | 0 |
| 0.9291666666666667 | 0 |
| 0.9298611111111111 | 0 |
| 0.9305555555555555 | 0 |
| 0.93125 | 0 |
| 0.9319444444444445 | 0 |
| 0.9326388888888889 | 0 |
| 0.9333333333333332 | 0 |
| 0.9340277777777778 | 0 |
| 0.9347222222222222 | 0 |
| 0.9354166666666667 | 0 |
| 0.936111111111111 | 0 |
| 0.9368055555555556 | 0 |
| 0.9375 | 0 |
| 0.9381944444444444 | 0 |
| 0.938888888888889 | 0 |
| 0.9395833333333333 | 0 |
| 0.9402777777777778 | 0 |
| 0.9409722222222222 | 0 |
| 0.9416666666666668 | 0 |
| 0.9423611111111111 | 0 |
| 0.9430555555555555 | 0 |
| 0.94375 | 0 |
| 0.9444444444444445 | 0 |
| 0.9451388888888889 | 0 |
| 0.9458333333333333 | 0 |
| 0.9465277777777777 | 0 |
| 0.9472222222222223 | 0 |
| 0.9479166666666666 | 0 |
| 0.9486111111111111 | 0 |
| 0.9493055555555556 | 0 |
| 0.9500000000000001 | 0 |
| 0.9506944444444444 | 0 |
| 0.9513888888888888 | 0 |
| 0.9520833333333334 | 0 |
| 0.9527777777777778 | 0 |
| 0.9534722222222222 | 0 |
| 0.9541666666666666 | 0 |
| 0.9548611111111112 | 0 |
| 0.9555555555555556 | 0 |
| 0.9562499999999999 | 0 |
| 0.9569444444444444 | 0 |
| 0.9576388888888889 | 0 |
| 0.9583333333333334 | 0 |
| 0.9590277777777777 | 0 |
| 0.9597222222222223 | 0 |
| 0.9604166666666667 | 0 |
| 0.9611111111111111 | 0 |
| 0.9618055555555555 | 0 |
| 0.9625 | 0 |
| 0.9631944444444445 | 0 |
| 0.9638888888888889 | 0 |
| 0.9645833333333332 | 0 |
| 0.9652777777777778 | 0 |
| 0.9659722222222222 | 0 |
| 0.9666666666666667 | 0 |
| 0.967361111111111 | 0 |
| 0.9680555555555556 | 0 |
| 0.96875 | 0 |
| 0.9694444444444444 | 0 |
| 0.970138888888889 | 0 |
| 0.9708333333333333 | 0 |
| 0.9715277777777778 | 0 |
| 0.9722222222222222 | 0 |
| 0.9729166666666668 | 0 |
| 0.9736111111111111 | 0 |
| 0.9743055555555555 | 0 |
| 0.975 | 0 |
| 0.9756944444444445 | 0 |
| 0.9763888888888889 | 0 |
| 0.9770833333333333 | 0 |
| 0.9777777777777777 | 0 |
| 0.9784722222222223 | 0 |
| 0.9791666666666666 | 0 |
| 0.9798611111111111 | 0 |
| 0.9805555555555556 | 0 |
| 0.9812500000000001 | 0 |
| 0.9819444444444444 | 0 |
| 0.9826388888888888 | 0 |
| 0.9833333333333334 | 0 |
| 0.9840277777777778 | 0 |
| 0.9847222222222222 | 0 |
| 0.9854166666666666 | 0 |
| 0.9861111111111112 | 0 |
| 0.9868055555555556 | 0 |
| 0.9874999999999999 | 0 |
| 0.9881944444444444 | 0 |
| 0.9888888888888889 | 0 |
| 0.9895833333333334 | 0 |
| 0.9902777777777777 | 0 |
| 0.9909722222222223 | 0 |
| 0.9916666666666667 | 0 |
| 0.9923611111111111 | 0 |
| 0.9930555555555555 | 0 |
| 0.99375 | 0 |
| 0.9944444444444445 | 0 |
| 0.9951388888888889 | 0 |
| 0.9958333333333332 | 0 |
| 0.9965277777777778 | 0 |
| 0.9972222222222222 | 0 |
| 0.9979166666666667 | 0 |
| 0.998611111111111 | 0 |
| 0.9993055555555556 | 0 |